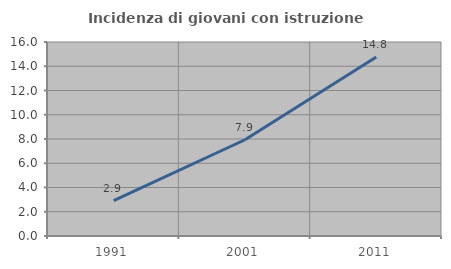
| Category | Incidenza di giovani con istruzione universitaria |
|---|---|
| 1991.0 | 2.92 |
| 2001.0 | 7.939 |
| 2011.0 | 14.77 |